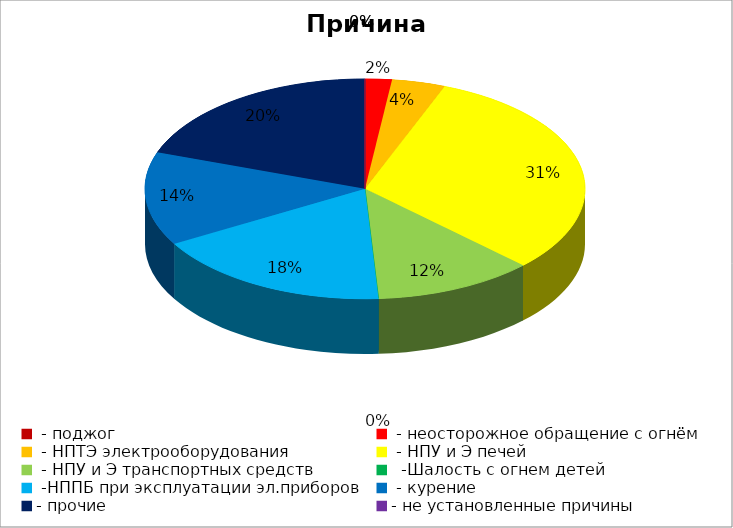
| Category | Причина пожара |
|---|---|
|  - поджог | 0 |
|  - неосторожное обращение с огнём | 1 |
|  - НПТЭ электрооборудования | 2 |
|  - НПУ и Э печей | 16 |
|  - НПУ и Э транспортных средств | 6 |
|   -Шалость с огнем детей | 0 |
|  -НППБ при эксплуатации эл.приборов | 9 |
|  - курение | 7 |
| - прочие | 10 |
| - не установленные причины | 0 |